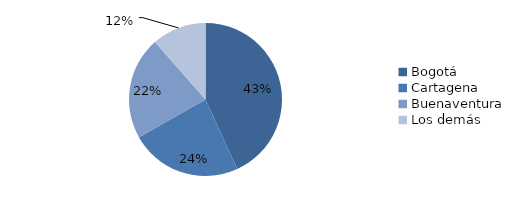
| Category | Series 0 |
|---|---|
| Bogotá | 670.74 |
| Cartagena | 367.153 |
| Buenaventura | 337.108 |
| Los demás | 178.483 |